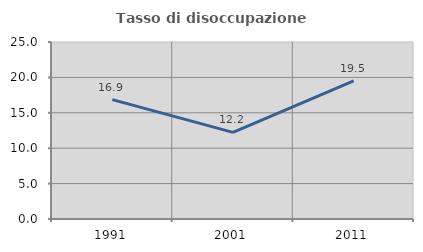
| Category | Tasso di disoccupazione giovanile  |
|---|---|
| 1991.0 | 16.864 |
| 2001.0 | 12.236 |
| 2011.0 | 19.512 |